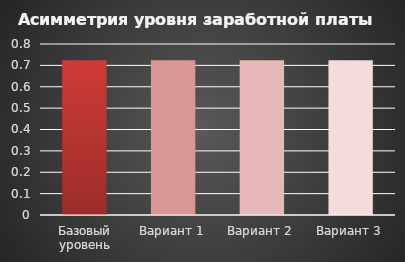
| Category | Асимметрия уровня заработной платы |
|---|---|
| Базовый уровень | 0.724 |
| Вариант 1 | 0.724 |
| Вариант 2 | 0.724 |
| Вариант 3 | 0.724 |